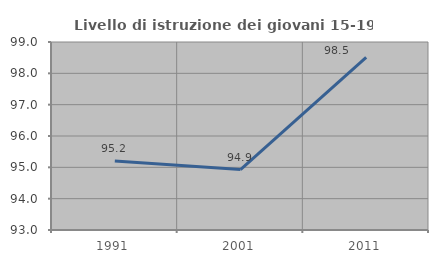
| Category | Livello di istruzione dei giovani 15-19 anni |
|---|---|
| 1991.0 | 95.205 |
| 2001.0 | 94.928 |
| 2011.0 | 98.507 |